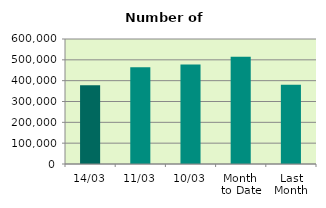
| Category | Series 0 |
|---|---|
| 14/03 | 378052 |
| 11/03 | 464832 |
| 10/03 | 477750 |
| Month 
to Date | 514351.8 |
| Last
Month | 380345.4 |